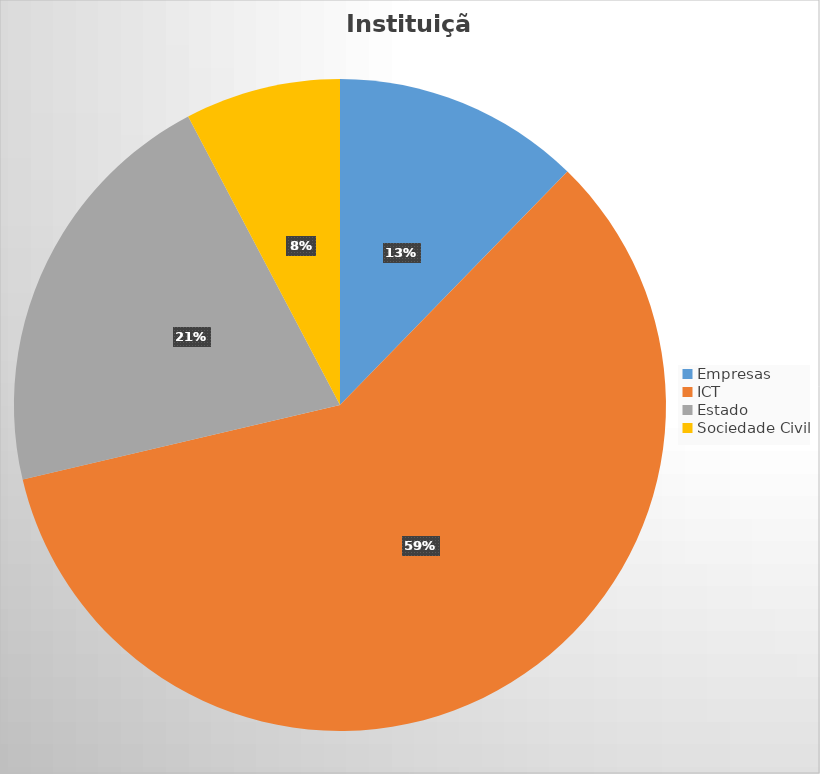
| Category | Series 0 |
|---|---|
| Empresas | 51 |
| ICT | 245 |
| Estado | 87 |
| Sociedade Civil | 32 |